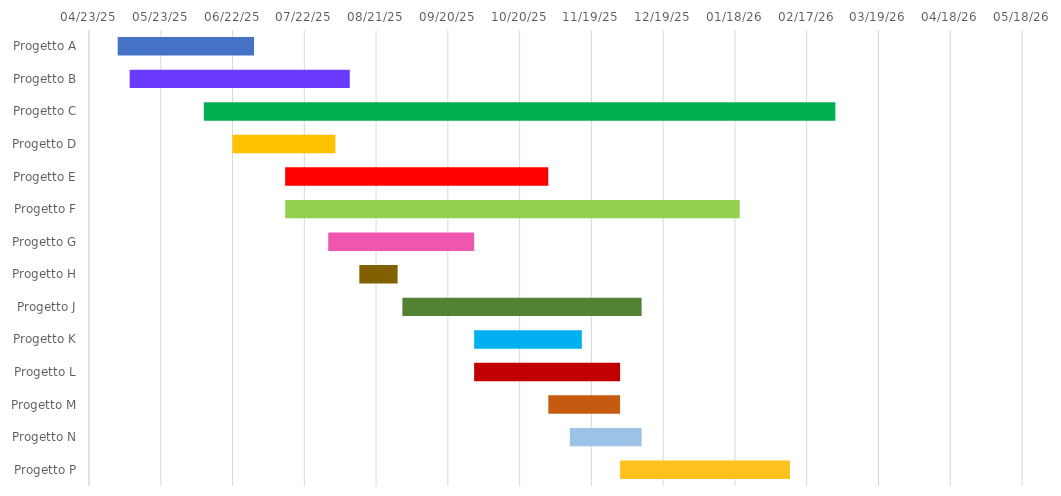
| Category | INIZIO | Durata |
|---|---|---|
| Progetto A | 2025-05-05 | 57 |
| Progetto B | 2025-05-10 | 92 |
| Progetto C | 2025-06-10 | 264 |
| Progetto D | 2025-06-22 | 43 |
| Progetto E | 2025-07-14 | 110 |
| Progetto F | 2025-07-14 | 190 |
| Progetto G | 2025-08-01 | 61 |
| Progetto H | 2025-08-14 | 16 |
| Progetto J | 2025-09-01 | 100 |
| Progetto K | 2025-10-01 | 45 |
| Progetto L | 2025-10-01 | 61 |
| Progetto M | 2025-11-01 | 30 |
| Progetto N | 2025-11-10 | 30 |
| Progetto P | 2025-12-01 | 71 |